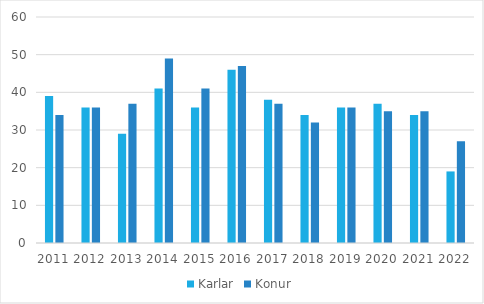
| Category | Karlar | Konur |
|---|---|---|
| 2011.0 | 39 | 34 |
| 2012.0 | 36 | 36 |
| 2013.0 | 29 | 37 |
| 2014.0 | 41 | 49 |
| 2015.0 | 36 | 41 |
| 2016.0 | 46 | 47 |
| 2017.0 | 38 | 37 |
| 2018.0 | 34 | 32 |
| 2019.0 | 36 | 36 |
| 2020.0 | 37 | 35 |
| 2021.0 | 34 | 35 |
| 2022.0 | 19 | 27 |